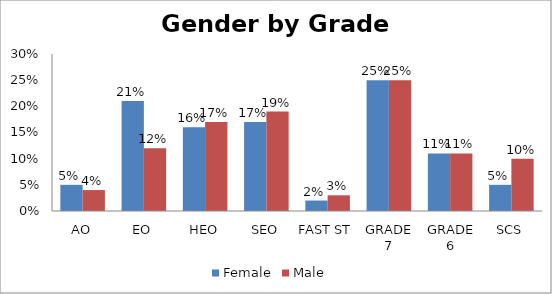
| Category | Female | Male |
|---|---|---|
| AO | 0.05 | 0.04 |
| EO | 0.21 | 0.12 |
| HEO | 0.16 | 0.17 |
| SEO | 0.17 | 0.19 |
| FAST ST | 0.02 | 0.03 |
| GRADE 7 | 0.25 | 0.25 |
| GRADE 6 | 0.11 | 0.11 |
| SCS | 0.05 | 0.1 |